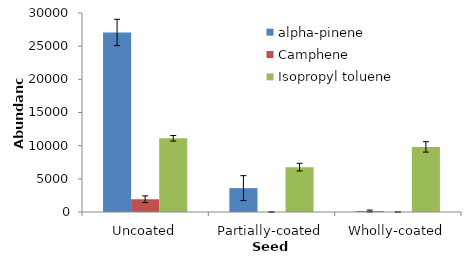
| Category | alpha-pinene | Camphene | Isopropyl toluene |
|---|---|---|---|
| Uncoated | 27068.667 | 1922.333 | 11108 |
| Partially-coated | 3598.333 | 0 | 6762.333 |
| Wholly-coated | 143.667 | 0 | 9812.667 |